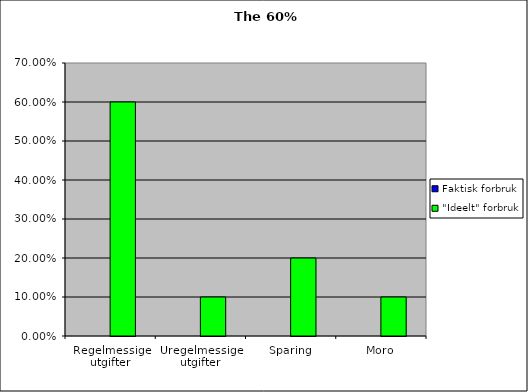
| Category | Faktisk forbruk | "Ideelt" forbruk |
|---|---|---|
| Regelmessige utgifter | 0 | 0.6 |
| Uregelmessige utgifter | 0 | 0.1 |
| Sparing | 0 | 0.2 |
| Moro | 0 | 0.1 |